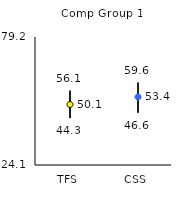
| Category | 25th | 75th | Mean |
|---|---|---|---|
| TFS | 44.3 | 56.1 | 50.14 |
| CSS | 46.6 | 59.6 | 53.4 |